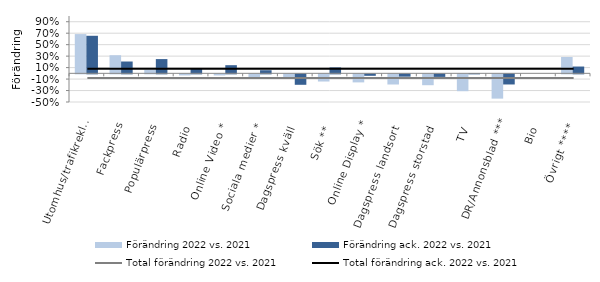
| Category | Förändring 2022 vs. 2021 | Förändring ack. 2022 vs. 2021 |
|---|---|---|
| Utomhus/trafikreklam | 0.685 | 0.655 |
| Fackpress | 0.316 | 0.206 |
| Populärpress | 0.062 | 0.248 |
| Radio | -0.019 | 0.089 |
| Online Video * | -0.019 | 0.142 |
| Sociala medier * | -0.047 | 0.054 |
| Dagspress kväll  | -0.053 | -0.183 |
| Sök ** | -0.125 | 0.103 |
| Online Display * | -0.141 | -0.026 |
| Dagspress landsort  | -0.177 | -0.041 |
| Dagspress storstad  | -0.19 | -0.045 |
| TV | -0.294 | 0.002 |
| DR/Annonsblad *** | -0.424 | -0.177 |
| Bio | 0 | 0 |
| Övrigt **** | 0.285 | 0.119 |